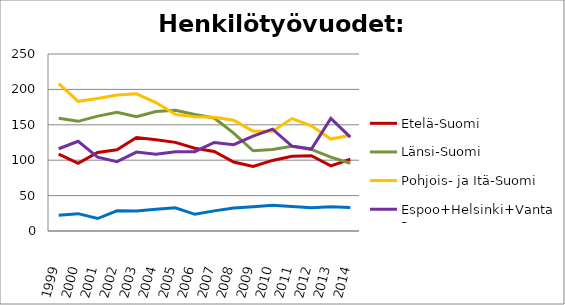
| Category | Etelä-Suomi | Länsi-Suomi | Pohjois- ja Itä-Suomi | Espoo+Helsinki+Vantaa | Muu Uusimaa |
|---|---|---|---|---|---|
| 1999.0 | 108.7 | 159.3 | 208 | 116.2 | 22.2 |
| 2000.0 | 95.7 | 154.9 | 183.2 | 126.7 | 24.5 |
| 2001.0 | 111 | 162.23 | 187.17 | 104.2 | 17.6 |
| 2002.0 | 114.82 | 167.56 | 192.02 | 97.9 | 28.56 |
| 2003.0 | 132.14 | 161.37 | 193.7 | 111.48 | 28.25 |
| 2004.0 | 128.9 | 168.84 | 181.43 | 108.29 | 30.82 |
| 2005.0 | 125.21 | 170.65 | 164.71 | 112 | 32.69 |
| 2006.0 | 116.98 | 164.43 | 161.32 | 112 | 23.56 |
| 2007.0 | 112.41 | 159.56 | 160.5 | 125 | 28.45 |
| 2008.0 | 97.36 | 138.34 | 156.48 | 122 | 32.51 |
| 2009.0 | 91.03 | 113.27 | 140.99 | 134 | 34.25 |
| 2010.0 | 99.7 | 114.98 | 141.01 | 143.9 | 36.42 |
| 2011.0 | 105.42 | 119.84 | 158.79 | 120 | 34.49 |
| 2012.0 | 106.29 | 115.24 | 148.7 | 115.8 | 32.99 |
| 2013.0 | 92.09 | 104.32 | 129.87 | 159.05 | 34.18 |
| 2014.0 | 101.38 | 95.75 | 135.37 | 132.69 | 33.33 |